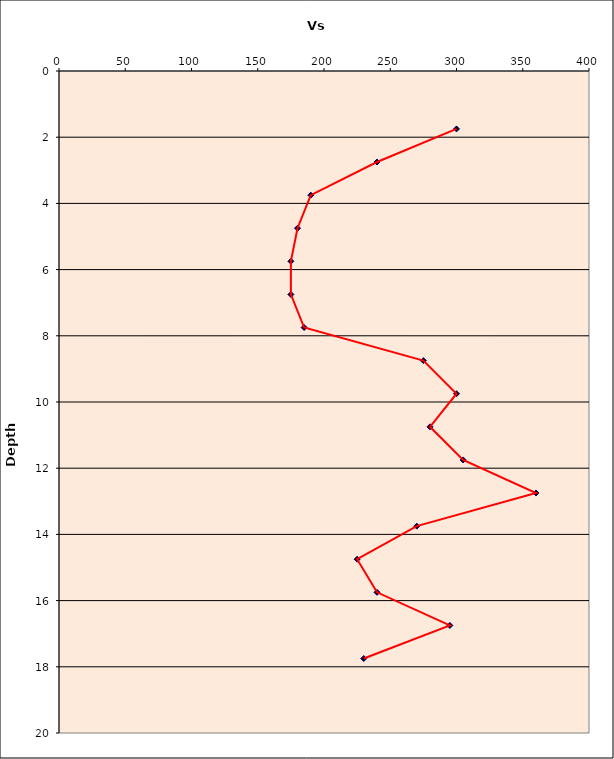
| Category | Series 0 |
|---|---|
| 300.0 | 1.75 |
| 240.0 | 2.75 |
| 190.0 | 3.75 |
| 180.0 | 4.75 |
| 175.0 | 5.75 |
| 175.0 | 6.75 |
| 185.0 | 7.75 |
| 275.0 | 8.75 |
| 300.0 | 9.75 |
| 280.0 | 10.75 |
| 305.0 | 11.75 |
| 360.0 | 12.75 |
| 270.0 | 13.75 |
| 225.0 | 14.75 |
| 240.0 | 15.75 |
| 295.0 | 16.75 |
| 230.0 | 17.75 |